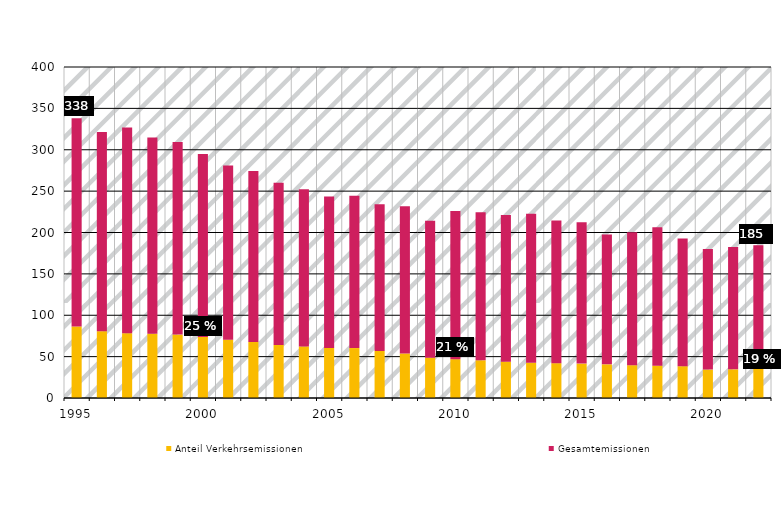
| Category | Anteil Verkehrsemissionen | Gesamtemissionen |
|---|---|---|
| 1995.0 | 86.436 | 251.484 |
| nan | 80.711 | 240.818 |
| nan | 78.3 | 248.633 |
| nan | 77.612 | 237.318 |
| nan | 76.602 | 232.675 |
| 2000.0 | 73.863 | 221.138 |
| nan | 70.521 | 210.347 |
| nan | 67.752 | 206.459 |
| nan | 64.111 | 195.886 |
| nan | 62.296 | 189.846 |
| 2005.0 | 60.53 | 183.047 |
| nan | 60.366 | 184.121 |
| nan | 56.873 | 177.4 |
| nan | 53.808 | 178.007 |
| nan | 48.781 | 165.328 |
| 2010.0 | 46.897 | 179.011 |
| nan | 45.557 | 179.02 |
| nan | 43.941 | 177.298 |
| nan | 42.682 | 179.857 |
| nan | 42.101 | 172.372 |
| 2015.0 | 41.56 | 170.865 |
| nan | 40.687 | 156.91 |
| nan | 39.642 | 160.553 |
| nan | 39.084 | 167.287 |
| nan | 38.421 | 154.264 |
| 2020.0 | 34.291 | 145.62 |
| nan | 34.632 | 147.877 |
| nan | 35.185 | 149.373 |